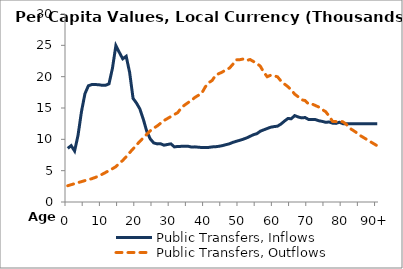
| Category | Public Transfers, Inflows | Public Transfers, Outflows |
|---|---|---|
| 0 | 8560.219 | 2597.666 |
|  | 8994.453 | 2760.918 |
| 2 | 8140.813 | 2924.17 |
| 3 | 10645.677 | 3087.423 |
| 4 | 14425.789 | 3250.675 |
| 5 | 17267.104 | 3413.927 |
| 6 | 18541.636 | 3553.385 |
| 7 | 18742.441 | 3722.155 |
| 8 | 18744.597 | 3916.63 |
| 9 | 18711.899 | 4154.22 |
| 10 | 18622.75 | 4414.983 |
| 11 | 18625.31 | 4710.971 |
| 12 | 18853.055 | 5022.696 |
| 13 | 21331.334 | 5315.224 |
| 14 | 24948.59 | 5635.286 |
| 15 | 23872.414 | 6166.182 |
| 16 | 22847.664 | 6632.991 |
| 17 | 23251.97 | 7220.048 |
| 18 | 20674.823 | 7876.522 |
| 19 | 16535.686 | 8480.726 |
| 20 | 15781.572 | 9085.603 |
| 21 | 14825.375 | 9702.736 |
| 22 | 13168.523 | 10251.932 |
| 23 | 11239.791 | 10810.509 |
| 24 | 10064.642 | 11361.928 |
| 25 | 9428.753 | 11790.162 |
| 26 | 9273.71 | 12127.269 |
| 27 | 9293.242 | 12565.904 |
| 28 | 9064.178 | 13001.587 |
| 29 | 9179.126 | 13320.402 |
| 30 | 9276.498 | 13648.434 |
| 31 | 8794.631 | 13961.679 |
| 32 | 8866.798 | 14265.787 |
| 33 | 8877.772 | 15023.186 |
| 34 | 8899.851 | 15474.399 |
| 35 | 8892.309 | 15854.952 |
| 36 | 8766.577 | 16239.1 |
| 37 | 8799.208 | 16695.82 |
| 38 | 8741.687 | 17027.509 |
| 39 | 8693.902 | 17393.224 |
| 40 | 8688.752 | 18367.791 |
| 41 | 8713.222 | 19039.139 |
| 42 | 8793.121 | 19395.575 |
| 43 | 8817.128 | 20245.667 |
| 44 | 8894.24 | 20500.75 |
| 45 | 9001.696 | 20743.936 |
| 46 | 9147.997 | 21152.557 |
| 47 | 9287.326 | 21352.065 |
| 48 | 9512.716 | 21973.314 |
| 49 | 9685.7 | 22690.456 |
| 50 | 9839.596 | 22702.724 |
| 51 | 10017.797 | 22817.788 |
| 52 | 10220.911 | 22573.235 |
| 53 | 10474.873 | 22739.092 |
| 54 | 10744.489 | 22419.773 |
| 55 | 10903.355 | 22106.05 |
| 56 | 11299.16 | 21670.752 |
| 57 | 11515.76 | 20694.337 |
| 58 | 11724.37 | 19988.767 |
| 59 | 11936.196 | 20229.057 |
| 60 | 12031.283 | 20146.876 |
| 61 | 12103.266 | 19972.59 |
| 62 | 12443.115 | 19304.532 |
| 63 | 12898.833 | 18830.777 |
| 64 | 13319.678 | 18410.058 |
| 65 | 13290.08 | 17879.757 |
| 66 | 13789.346 | 17204.934 |
| 67 | 13567.195 | 16788.233 |
| 68 | 13423.088 | 16310.656 |
| 69 | 13482.059 | 16191.555 |
| 70 | 13180.728 | 15645.185 |
| 71 | 13178.358 | 15651.277 |
| 72 | 13149.766 | 15395.804 |
| 73 | 12963.17 | 15152.76 |
| 74 | 12862.854 | 14746.779 |
| 75 | 12719.245 | 14409.8 |
| 76 | 12765.942 | 13705.009 |
| 77 | 12581.633 | 12865.134 |
| 78 | 12544.832 | 12825.617 |
| 79 | 12729.11 | 12920.39 |
| 80 | 12505.79 | 12792.5 |
| 81 | 12505.79 | 12389.063 |
| 82 | 12505.79 | 11764.926 |
| 83 | 12505.79 | 11425.675 |
| 84 | 12505.79 | 11048.677 |
| 85 | 12505.79 | 10617.11 |
| 86 | 12505.79 | 10285.781 |
| 87 | 12505.79 | 9954.592 |
| 88 | 12505.79 | 9623.402 |
| 89 | 12505.79 | 9292.213 |
| 90+ | 12505.79 | 8961.024 |